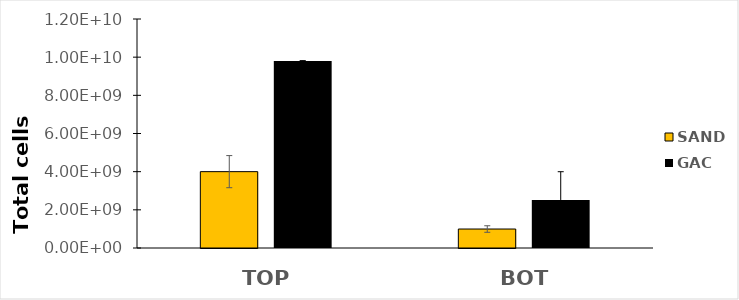
| Category | SAND | GAC |
|---|---|---|
| TOP | 4000785008.071 | 9803341972.98 |
| BOT | 994709459.229 | 2517132120.75 |